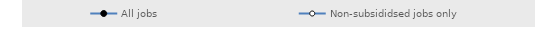
| Category | All jobs | Non-subsididsed jobs only |
|---|---|---|
| 6.0 | 0.56 | 0.103 |
| 12.0 | 0.365 | 0.142 |
| 18.0 | 0.163 | 0.107 |
| 24.0 | 0.102 | 0.094 |
| 30.0 | 0.09 | 0.124 |
| 36.0 | 0.079 | 0.11 |
| 42.0 | 0.11 | 0.136 |
| 48.0 | 0.133 | 0.15 |